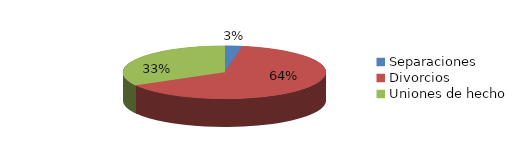
| Category | Series 0 |
|---|---|
| Separaciones | 16 |
| Divorcios | 373 |
| Uniones de hecho | 193 |